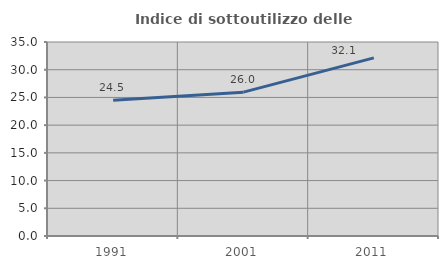
| Category | Indice di sottoutilizzo delle abitazioni  |
|---|---|
| 1991.0 | 24.503 |
| 2001.0 | 25.952 |
| 2011.0 | 32.142 |